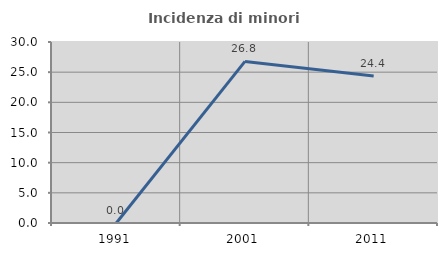
| Category | Incidenza di minori stranieri |
|---|---|
| 1991.0 | 0 |
| 2001.0 | 26.786 |
| 2011.0 | 24.37 |